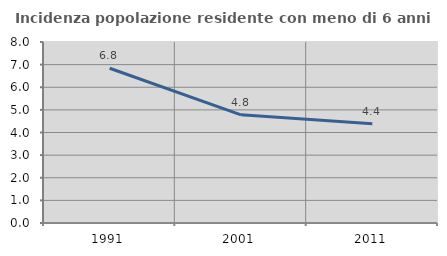
| Category | Incidenza popolazione residente con meno di 6 anni |
|---|---|
| 1991.0 | 6.84 |
| 2001.0 | 4.779 |
| 2011.0 | 4.387 |